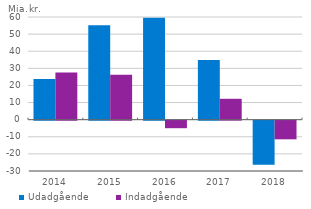
| Category | Udadgående | Indadgående |
|---|---|---|
| 2014.0 | 23.8 | 27.5 |
| 2015.0 | 55.2 | 26.2 |
| 2016.0 | 59.5 | -4.4 |
| 2017.0 | 34.8 | 12.2 |
| 2018.0 | -25.7 | -10.9 |